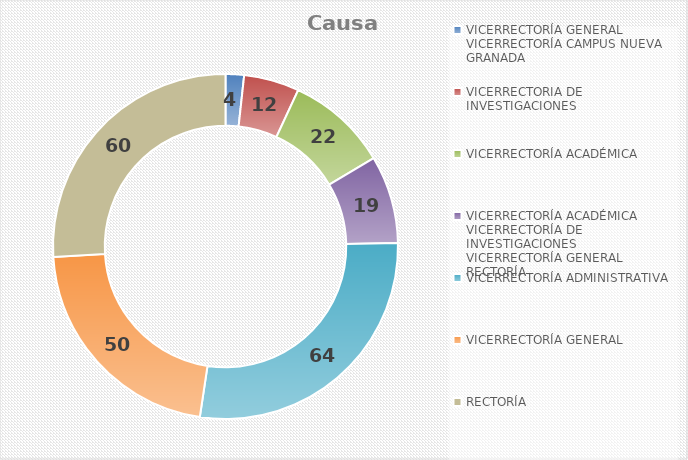
| Category | Causas |
|---|---|
| VICERRECTORÍA GENERAL
VICERRECTORÍA CAMPUS NUEVA GRANADA | 4 |
| VICERRECTORIA DE INVESTIGACIONES | 12 |
| VICERRECTORÍA ACADÉMICA | 22 |
| VICERRECTORÍA ACADÉMICA
VICERRECTORÍA DE INVESTIGACIONES
VICERRECTORÍA GENERAL
RECTORÍA


 | 19 |
| VICERRECTORÍA ADMINISTRATIVA | 64 |
| VICERRECTORÍA GENERAL | 50 |
| RECTORÍA | 60 |